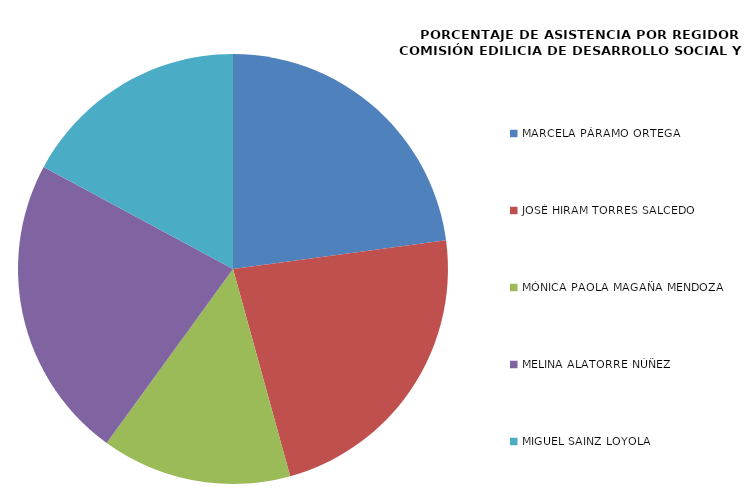
| Category | Series 0 |
|---|---|
| MARCELA PÁRAMO ORTEGA | 100 |
| JOSÉ HIRAM TORRES SALCEDO | 100 |
| MÓNICA PAOLA MAGAÑA MENDOZA | 62.5 |
| MELINA ALATORRE NÚÑEZ | 100 |
| MIGUEL SAINZ LOYOLA | 75 |